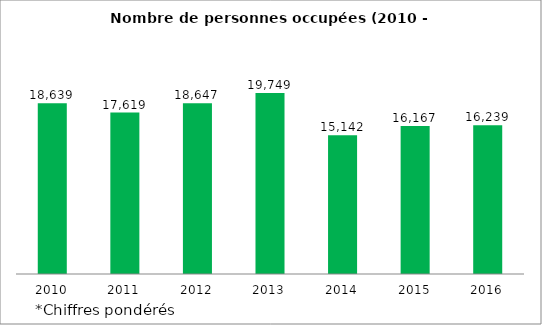
| Category | Nombre de personnes occupées |
|---|---|
| 2010 | 18639 |
| 2011 | 17619 |
| 2012 | 18647 |
| 2013 | 19749 |
| 2014 | 15142.36 |
| 2015 | 16167 |
| 2016 | 16239 |